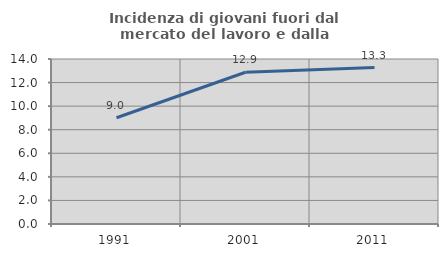
| Category | Incidenza di giovani fuori dal mercato del lavoro e dalla formazione  |
|---|---|
| 1991.0 | 9.015 |
| 2001.0 | 12.877 |
| 2011.0 | 13.272 |